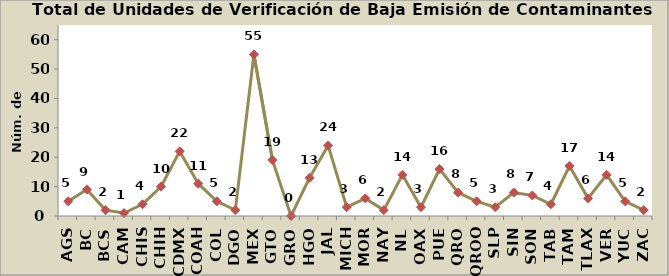
| Category | Total |
|---|---|
| AGS | 5 |
| BC | 9 |
| BCS | 2 |
| CAM | 1 |
| CHIS | 4 |
| CHIH | 10 |
| CDMX | 22 |
| COAH | 11 |
| COL | 5 |
| DGO | 2 |
| MEX | 55 |
| GTO | 19 |
| GRO | 0 |
| HGO | 13 |
| JAL | 24 |
| MICH | 3 |
| MOR | 6 |
| NAY | 2 |
| NL | 14 |
| OAX | 3 |
| PUE | 16 |
| QRO | 8 |
| QROO | 5 |
| SLP | 3 |
| SIN | 8 |
| SON | 7 |
| TAB | 4 |
| TAM | 17 |
| TLAX | 6 |
| VER | 14 |
| YUC | 5 |
| ZAC | 2 |